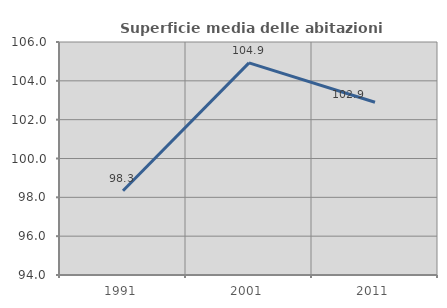
| Category | Superficie media delle abitazioni occupate |
|---|---|
| 1991.0 | 98.342 |
| 2001.0 | 104.922 |
| 2011.0 | 102.894 |